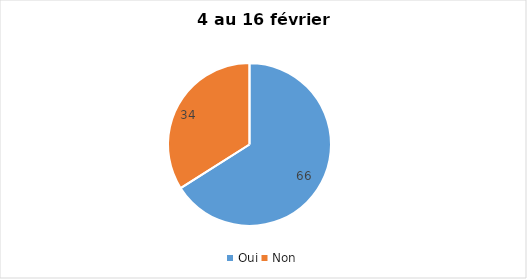
| Category | Series 0 |
|---|---|
| Oui | 66 |
| Non | 34 |